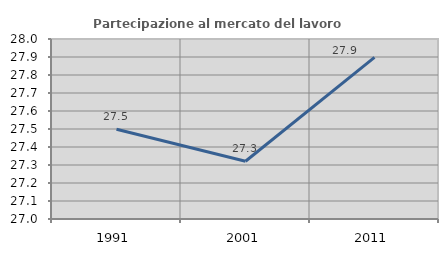
| Category | Partecipazione al mercato del lavoro  femminile |
|---|---|
| 1991.0 | 27.499 |
| 2001.0 | 27.321 |
| 2011.0 | 27.898 |